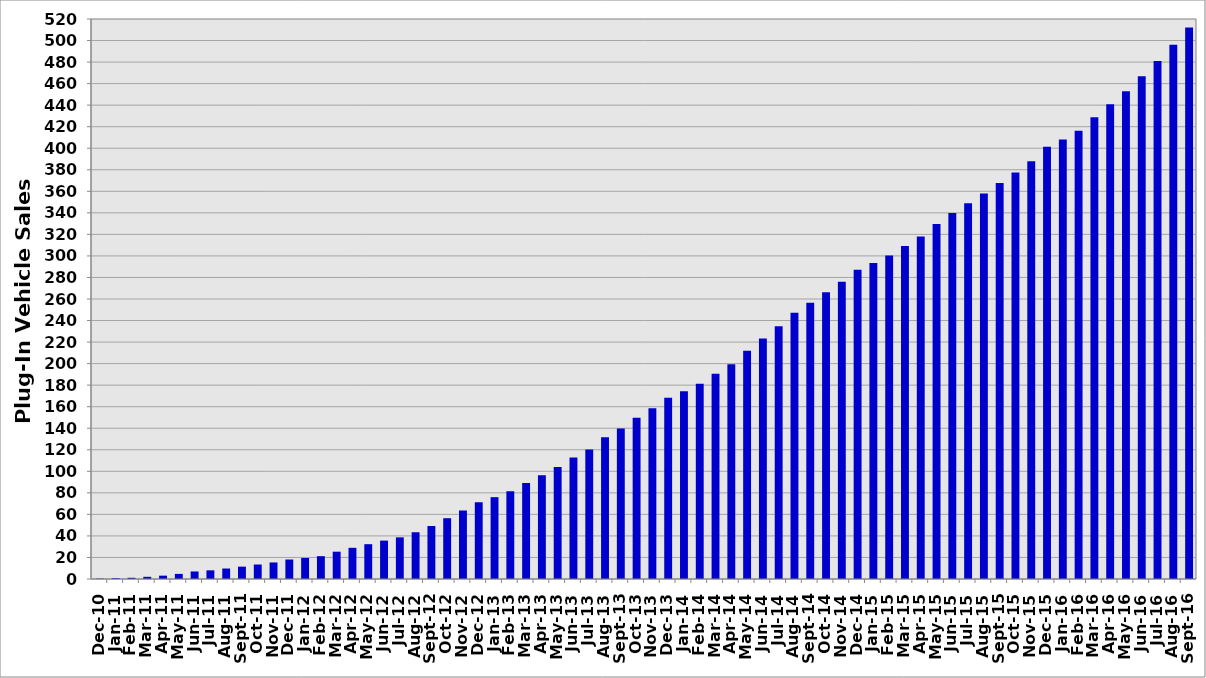
| Category | Series 0 |
|---|---|
| 2010-12-01 | 345 |
| 2011-01-01 | 769 |
| 2011-02-01 | 1133 |
| 2011-03-01 | 2039 |
| 2011-04-01 | 3105 |
| 2011-05-01 | 4736 |
| 2011-06-01 | 7005 |
| 2011-07-01 | 8062 |
| 2011-08-01 | 9727 |
| 2011-09-01 | 11481 |
| 2011-10-01 | 13455 |
| 2011-11-01 | 15367 |
| 2011-12-01 | 18108 |
| 2012-01-01 | 19535 |
| 2012-02-01 | 21197 |
| 2012-03-01 | 25358 |
| 2012-04-01 | 28953 |
| 2012-05-01 | 32331 |
| 2012-06-01 | 35649 |
| 2012-07-01 | 38665 |
| 2012-08-01 | 43409 |
| 2012-09-01 | 49218 |
| 2012-10-01 | 56450 |
| 2012-11-01 | 63608 |
| 2012-12-01 | 71277 |
| 2013-01-01 | 76003 |
| 2013-02-01 | 81458 |
| 2013-03-01 | 89090 |
| 2013-04-01 | 96228 |
| 2013-05-01 | 103982 |
| 2013-06-01 | 112724 |
| 2013-07-01 | 120166 |
| 2013-08-01 | 131529 |
| 2013-09-01 | 139656 |
| 2013-10-01 | 149756 |
| 2013-11-01 | 158589 |
| 2013-12-01 | 168379 |
| 2014-01-01 | 174284 |
| 2014-02-01 | 181329 |
| 2014-03-01 | 190501 |
| 2014-04-01 | 199406 |
| 2014-05-01 | 211859 |
| 2014-06-01 | 223352 |
| 2014-07-01 | 234785 |
| 2014-08-01 | 247188 |
| 2014-09-01 | 256528 |
| 2014-10-01 | 266190 |
| 2014-11-01 | 275975 |
| 2014-12-01 | 287261 |
| 2015-01-01 | 293351 |
| 2015-02-01 | 300375 |
| 2015-03-01 | 309110 |
| 2015-04-01 | 318109 |
| 2015-05-01 | 329582 |
| 2015-06-01 | 339966 |
| 2015-07-01 | 348945 |
| 2015-08-01 | 357955 |
| 2015-09-01 | 367697 |
| 2015-10-01 | 377518 |
| 2015-11-01 | 387896 |
| 2015-12-01 | 401284 |
| 2016-01-01 | 407997 |
| 2016-02-01 | 416330 |
| 2016-03-01 | 428764 |
| 2016-04-01 | 440872 |
| 2016-05-01 | 453017 |
| 2016-06-01 | 466808 |
| 2016-07-01 | 481095 |
| 2016-08-01 | 496068 |
| 2016-09-01 | 512137 |